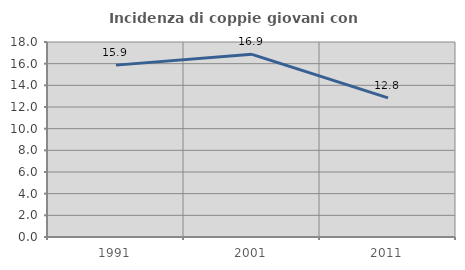
| Category | Incidenza di coppie giovani con figli |
|---|---|
| 1991.0 | 15.865 |
| 2001.0 | 16.858 |
| 2011.0 | 12.838 |